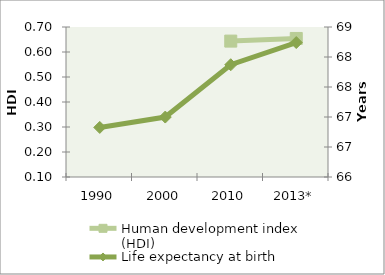
| Category | Human development index (HDI) |
|---|---|
| 1990 | 0 |
| 2000 | 0 |
| 2010 | 0.644 |
| 2013* | 0.654 |